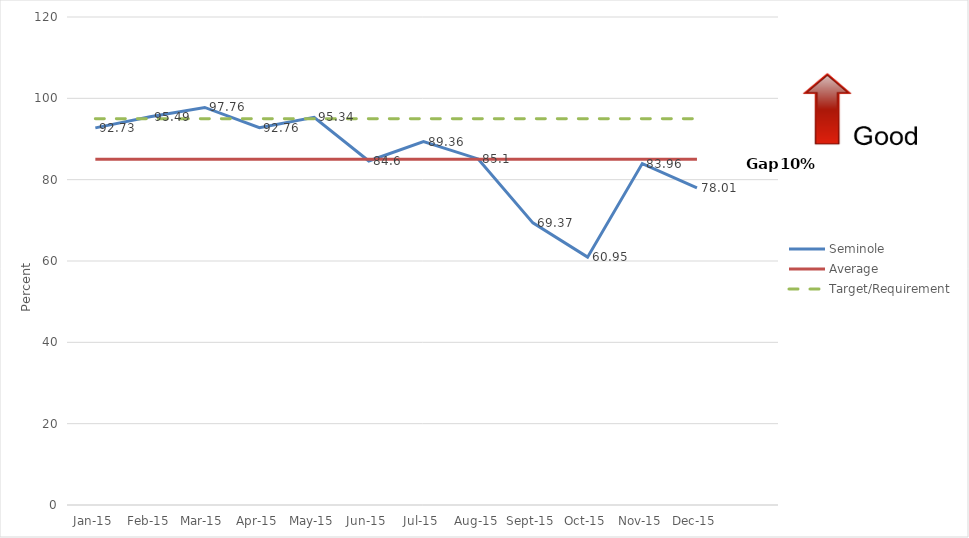
| Category | Seminole | Average  | Target/Requirement |
|---|---|---|---|
| Jan-15 | 92.73 | 85 | 95 |
| Feb-15 | 95.49 | 85 | 95 |
| Mar-15 | 97.76 | 85 | 95 |
| Apr-15 | 92.76 | 85 | 95 |
| May-15 | 95.34 | 85 | 95 |
| Jun-15 | 84.6 | 85 | 95 |
| Jul-15 | 89.36 | 85 | 95 |
| Aug-15 | 85.1 | 85 | 95 |
| Sep-15 | 69.37 | 85 | 95 |
| Oct-15 | 60.95 | 85 | 95 |
| Nov-15 | 83.96 | 85 | 95 |
| Dec-15 | 78.01 | 85 | 95 |